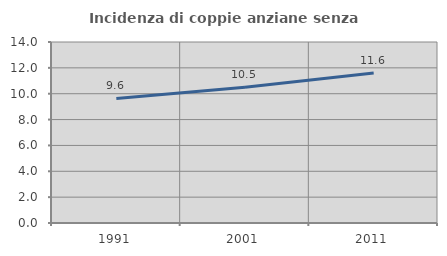
| Category | Incidenza di coppie anziane senza figli  |
|---|---|
| 1991.0 | 9.639 |
| 2001.0 | 10.5 |
| 2011.0 | 11.607 |